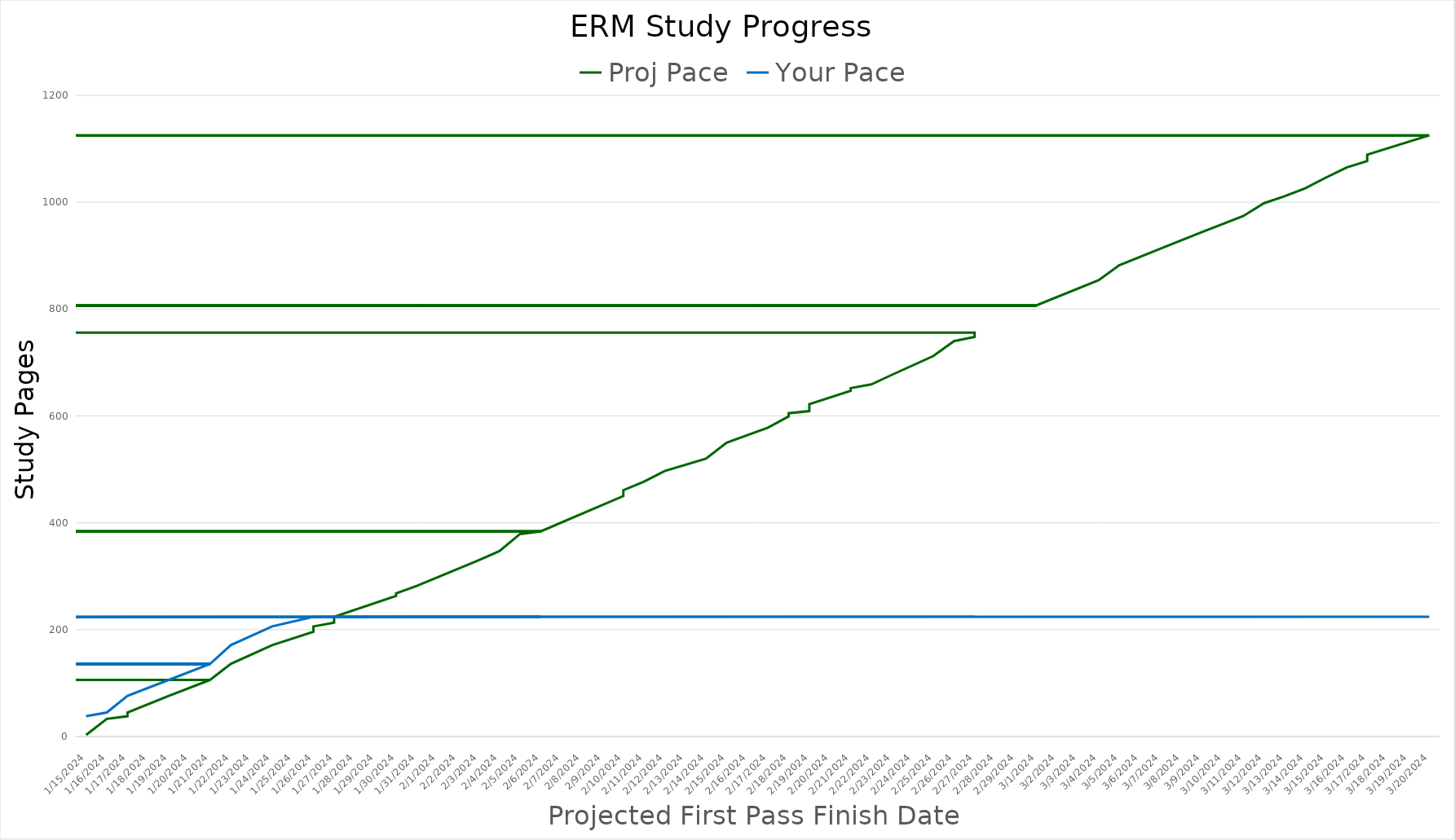
| Category | Proj Pace | Your Pace |
|---|---|---|
| 1/15/24 | 3 | 38 |
| 1/16/24 | 33 | 45 |
| 1/17/24 | 38 | 76 |
| 1/17/24 | 45 | 76 |
| 1/19/24 | 76 | 106 |
| 1/21/24 | 106 | 136 |
| nan | 106 | 0 |
| 1/21/24 | 106 | 136 |
| 1/22/24 | 136 | 171 |
| 1/24/24 | 171 | 206 |
| 1/26/24 | 196 | 224 |
| 1/26/24 | 206 | 224 |
| 1/27/24 | 213 | 224 |
| 1/27/24 | 224 | 224 |
| 1/27/24 | 224 | 224 |
| 1/30/24 | 263 | 224 |
| 1/30/24 | 268 | 224 |
| 1/31/24 | 282 | 224 |
| 2/3/24 | 330 | 224 |
| 2/4/24 | 347 | 224 |
| 2/5/24 | 379 | 224 |
| 2/6/24 | 384 | 224 |
| nan | 384 | 0 |
| 2/6/24 | 384 | 224 |
| 2/10/24 | 450 | 224 |
| 2/10/24 | 461 | 224 |
| 2/11/24 | 477 | 224 |
| 2/12/24 | 497 | 224 |
| 2/14/24 | 520 | 224 |
| 2/15/24 | 550 | 224 |
| 2/17/24 | 578 | 224 |
| 2/18/24 | 599 | 224 |
| 2/18/24 | 605 | 224 |
| 2/19/24 | 609 | 224 |
| 2/19/24 | 622 | 224 |
| 2/21/24 | 647 | 224 |
| 2/21/24 | 652 | 224 |
| 2/22/24 | 659 | 224 |
| 2/23/24 | 677 | 224 |
| 2/25/24 | 712 | 224 |
| 2/26/24 | 740 | 224 |
| 2/27/24 | 748 | 224 |
| 2/27/24 | 756 | 224 |
| nan | 756 | 0 |
| 3/1/24 | 807 | 224 |
| 3/4/24 | 854 | 224 |
| 3/5/24 | 882 | 224 |
| 3/7/24 | 913 | 224 |
| 3/9/24 | 944 | 224 |
| 3/11/24 | 974 | 224 |
| 3/12/24 | 998 | 224 |
| 3/13/24 | 1011 | 224 |
| 3/14/24 | 1026 | 224 |
| 3/15/24 | 1046 | 224 |
| 3/16/24 | 1065 | 224 |
| 3/17/24 | 1077 | 224 |
| 3/17/24 | 1089 | 224 |
| 3/20/24 | 1125 | 224 |
| nan | 1125 | 0 |